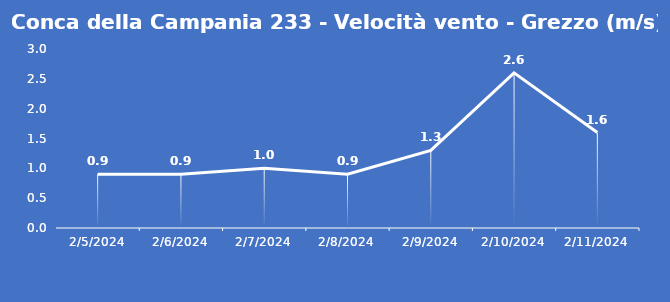
| Category | Conca della Campania 233 - Velocità vento - Grezzo (m/s) |
|---|---|
| 2/5/24 | 0.9 |
| 2/6/24 | 0.9 |
| 2/7/24 | 1 |
| 2/8/24 | 0.9 |
| 2/9/24 | 1.3 |
| 2/10/24 | 2.6 |
| 2/11/24 | 1.6 |